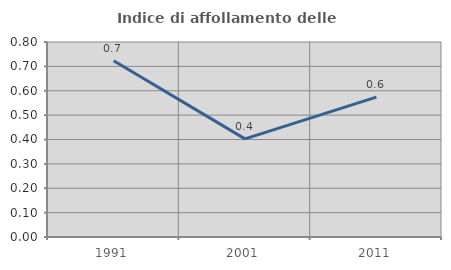
| Category | Indice di affollamento delle abitazioni  |
|---|---|
| 1991.0 | 0.723 |
| 2001.0 | 0.403 |
| 2011.0 | 0.574 |